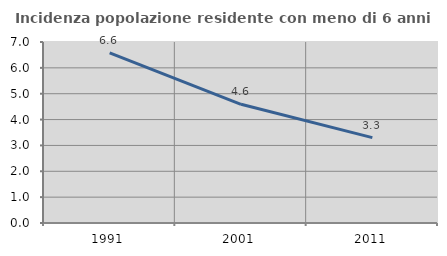
| Category | Incidenza popolazione residente con meno di 6 anni |
|---|---|
| 1991.0 | 6.581 |
| 2001.0 | 4.591 |
| 2011.0 | 3.303 |